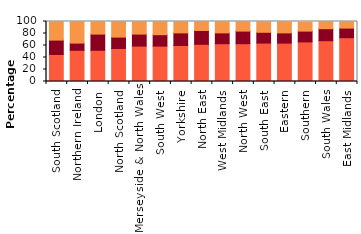
| Category | Direct Debit | Credit | Prepayment |
|---|---|---|---|
| South Scotland | 45 | 24 | 31 |
| Northern Ireland | 52 | 12 | 36 |
| London | 52 | 27 | 21 |
| North Scotland | 55 | 19 | 26 |
| Merseyside & North Wales | 59 | 20 | 21 |
| South West | 59 | 19 | 22 |
| Yorkshire | 60 | 21 | 19 |
| North East | 62 | 23 | 15 |
| West Midlands | 63 | 18 | 19 |
| North West | 63 | 21 | 16 |
| South East | 64 | 18 | 18 |
| Eastern | 64 | 17 | 19 |
| Southern | 66 | 18 | 15 |
| South Wales | 68 | 20 | 13 |
| East Midlands | 73 | 16 | 11 |